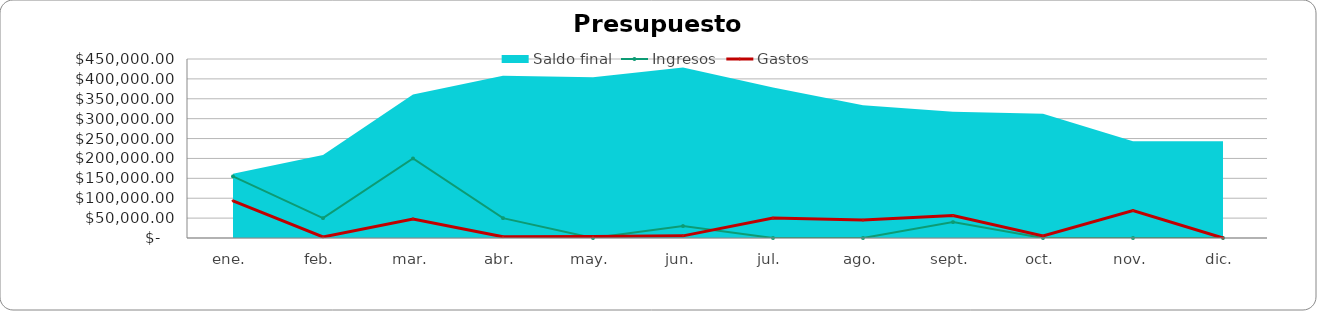
| Category | Ingresos | Gastos |
|---|---|---|
| 0 | 155000 | 93500 |
| 1 | 50000 | 2600 |
| 2 | 200000 | 48000 |
| 3 | 50000 | 3000 |
| 4 | 0 | 4000 |
| 5 | 30000 | 5400 |
| 6 | 0 | 50000 |
| 7 | 0 | 45000 |
| 8 | 40000 | 56400 |
| 9 | 0 | 5000 |
| 10 | 0 | 69000 |
| 11 | 0 | 0 |